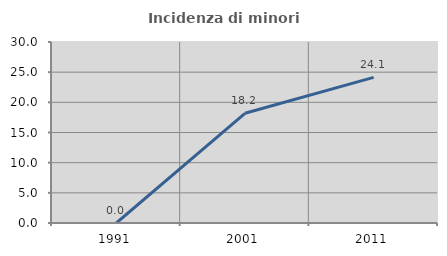
| Category | Incidenza di minori stranieri |
|---|---|
| 1991.0 | 0 |
| 2001.0 | 18.182 |
| 2011.0 | 24.138 |